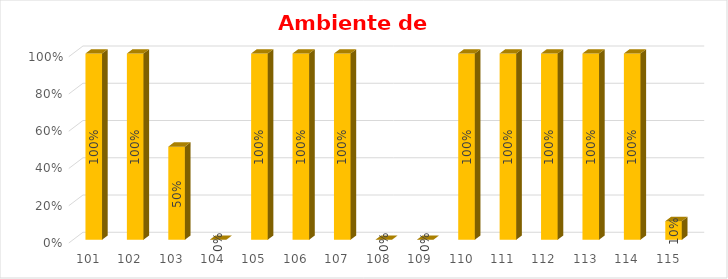
| Category | % Avance |
|---|---|
| 101.0 | 1 |
| 102.0 | 1 |
| 103.0 | 0.5 |
| 104.0 | 0 |
| 105.0 | 1 |
| 106.0 | 1 |
| 107.0 | 1 |
| 108.0 | 0 |
| 109.0 | 0 |
| 110.0 | 1 |
| 111.0 | 1 |
| 112.0 | 1 |
| 113.0 | 1 |
| 114.0 | 1 |
| 115.0 | 0.1 |